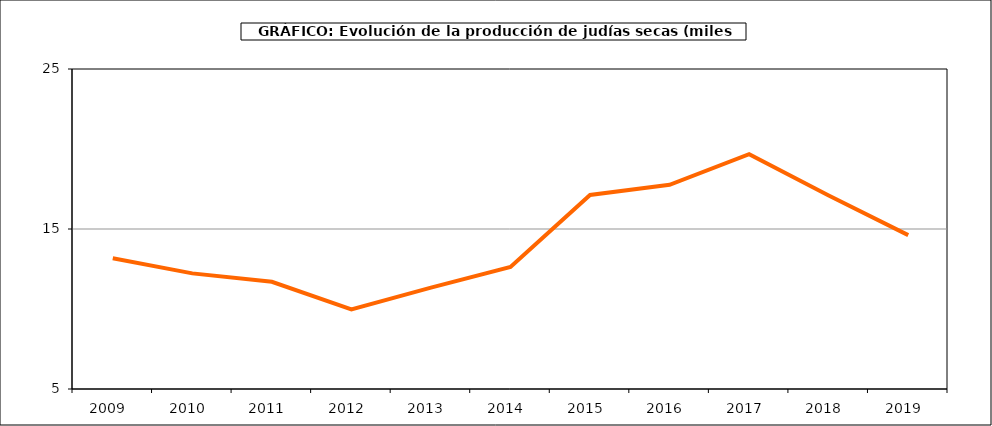
| Category | Superficie |
|---|---|
| 2009.0 | 13.175 |
| 2010.0 | 12.226 |
| 2011.0 | 11.701 |
| 2012.0 | 9.971 |
| 2013.0 | 11.337 |
| 2014.0 | 12.629 |
| 2015.0 | 17.125 |
| 2016.0 | 17.761 |
| 2017.0 | 19.675 |
| 2018.0 | 17.091 |
| 2019.0 | 14.615 |